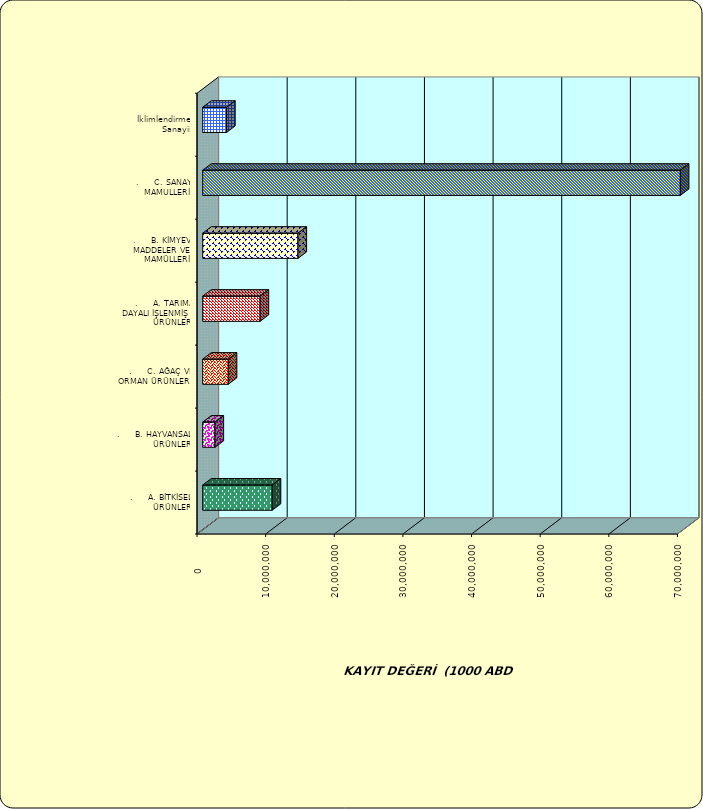
| Category | Series 0 |
|---|---|
| .     A. BİTKİSEL ÜRÜNLER | 10125749.213 |
| .     B. HAYVANSAL ÜRÜNLER | 1795939.004 |
| .     C. AĞAÇ VE ORMAN ÜRÜNLERİ | 3720082.025 |
| .     A. TARIMA DAYALI İŞLENMİŞ ÜRÜNLER | 8360559.215 |
| .     B. KİMYEVİ MADDELER VE MAMÜLLERİ | 13885154.127 |
| .     C. SANAYİ MAMULLERİ | 69585129.673 |
|  İklimlendirme Sanayii | 3479662.982 |